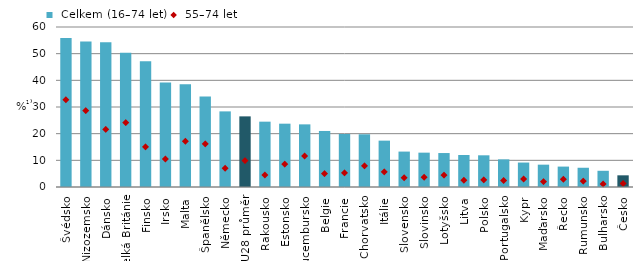
| Category |  Celkem (16–74 let) |
|---|---|
| Švédsko | 55.852 |
| Nizozemsko | 54.605 |
| Dánsko | 54.305 |
| Velká Británie | 50.328 |
| Finsko | 47.142 |
| Irsko | 39.147 |
| Malta | 38.514 |
| Španělsko | 33.895 |
| Německo | 28.357 |
| EU28 průměr | 26.488 |
| Rakousko | 24.5 |
| Estonsko | 23.745 |
| Lucembursko | 23.49 |
| Belgie | 21.012 |
| Francie | 19.886 |
| Chorvatsko | 19.764 |
| Itálie | 17.386 |
| Slovensko | 13.282 |
| Slovinsko | 12.88 |
| Lotyšsko | 12.737 |
| Litva | 11.995 |
| Polsko | 11.886 |
| Portugalsko | 10.366 |
| Kypr | 9.169 |
| Maďarsko | 8.376 |
| Řecko | 7.654 |
| Rumunsko | 7.217 |
| Bulharsko | 6.082 |
| Česko | 4.378 |